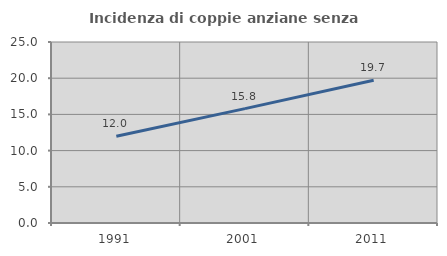
| Category | Incidenza di coppie anziane senza figli  |
|---|---|
| 1991.0 | 11.99 |
| 2001.0 | 15.795 |
| 2011.0 | 19.721 |